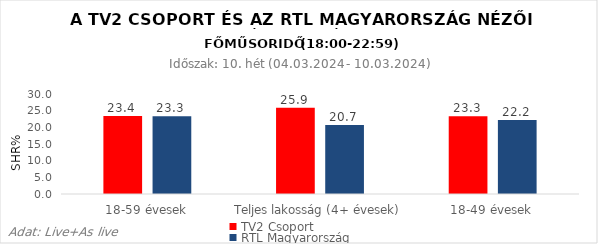
| Category | TV2 Csoport | RTL Magyarország |
|---|---|---|
| 18-59 évesek | 23.4 | 23.3 |
| Teljes lakosság (4+ évesek) | 25.9 | 20.7 |
| 18-49 évesek | 23.3 | 22.2 |